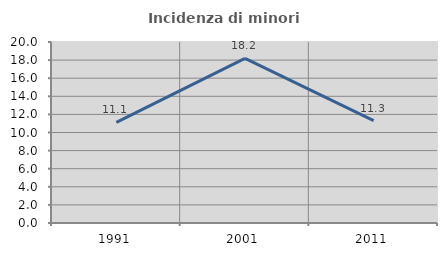
| Category | Incidenza di minori stranieri |
|---|---|
| 1991.0 | 11.111 |
| 2001.0 | 18.182 |
| 2011.0 | 11.321 |